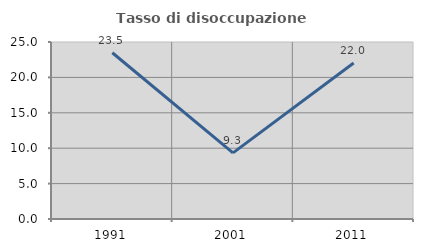
| Category | Tasso di disoccupazione giovanile  |
|---|---|
| 1991.0 | 23.478 |
| 2001.0 | 9.333 |
| 2011.0 | 22.034 |